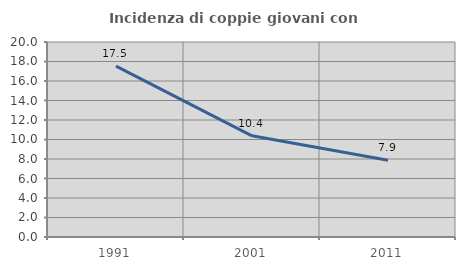
| Category | Incidenza di coppie giovani con figli |
|---|---|
| 1991.0 | 17.532 |
| 2001.0 | 10.379 |
| 2011.0 | 7.874 |